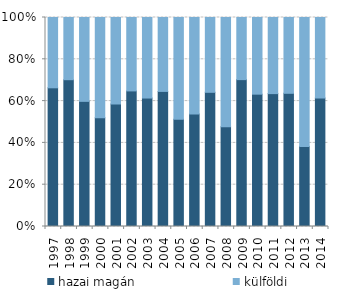
| Category | hazai magán | külföldi |
|---|---|---|
| 1997.0 | 288000000 | 146000000 |
| 1998.0 | 198000000 | 83900000 |
| 1999.0 | 294000000 | 197000000 |
| 2000.0 | 269000000 | 248000000 |
| 2001.0 | 259000000 | 183000000 |
| 2002.0 | 253000000 | 137000000 |
| 2003.0 | 252000000 | 158000000 |
| 2004.0 | 446000000 | 244000000 |
| 2005.0 | 281000000 | 267000000 |
| 2006.0 | 305000000 | 261000000 |
| 2007.0 | 583000000 | 325000000 |
| 2008.0 | 276000000 | 302000000 |
| 2009.0 | 305000000 | 129000000 |
| 2010.0 | 183000000 | 106000000 |
| 2011.0 | 199000000 | 114000000 |
| 2012.0 | 181000000 | 103000000 |
| 2013.0 | 136000000 | 219000000 |
| 2014.0 | 124000000 | 77700000 |